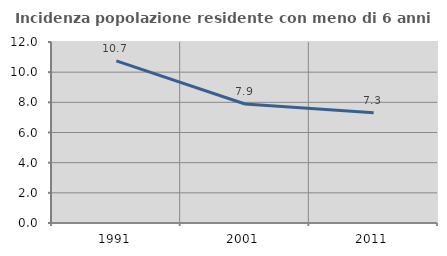
| Category | Incidenza popolazione residente con meno di 6 anni |
|---|---|
| 1991.0 | 10.747 |
| 2001.0 | 7.887 |
| 2011.0 | 7.315 |